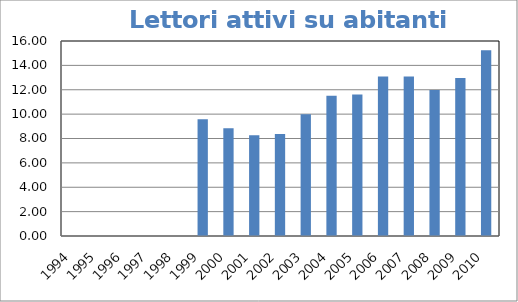
| Category | Lettori attivi su abitanti (%) |
|---|---|
| 1994.0 | 0 |
| 1995.0 | 0 |
| 1996.0 | 0 |
| 1997.0 | 0 |
| 1998.0 | 0 |
| 1999.0 | 9.569 |
| 2000.0 | 8.851 |
| 2001.0 | 8.273 |
| 2002.0 | 8.377 |
| 2003.0 | 9.983 |
| 2004.0 | 11.503 |
| 2005.0 | 11.604 |
| 2006.0 | 13.094 |
| 2007.0 | 13.095 |
| 2008.0 | 11.98 |
| 2009.0 | 12.962 |
| 2010.0 | 15.233 |